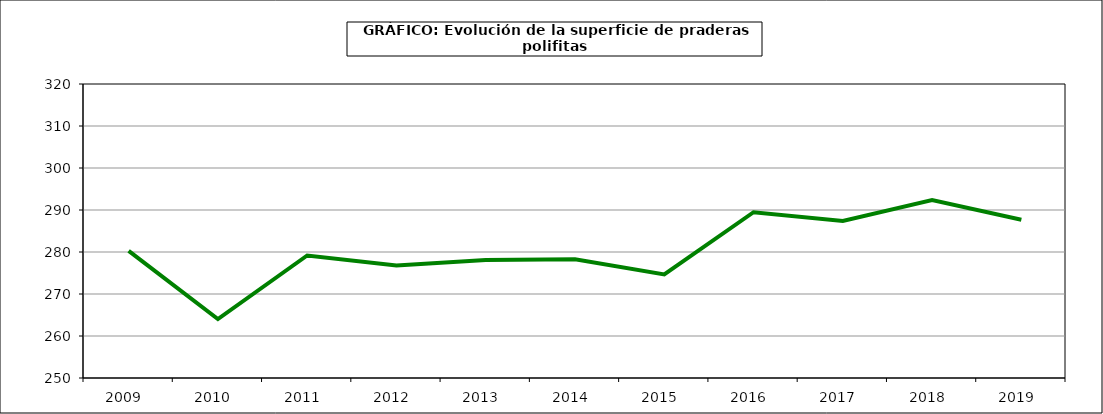
| Category | Superficie |
|---|---|
| 2009.0 | 280.266 |
| 2010.0 | 264.037 |
| 2011.0 | 279.178 |
| 2012.0 | 276.784 |
| 2013.0 | 278.082 |
| 2014.0 | 278.257 |
| 2015.0 | 274.641 |
| 2016.0 | 289.468 |
| 2017.0 | 287.402 |
| 2018.0 | 292.359 |
| 2019.0 | 287.689 |